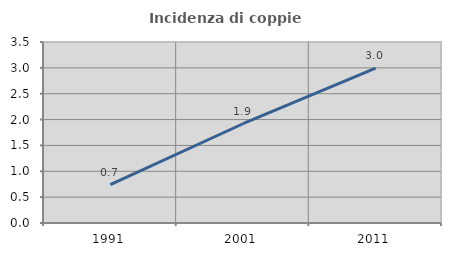
| Category | Incidenza di coppie miste |
|---|---|
| 1991.0 | 0.743 |
| 2001.0 | 1.919 |
| 2011.0 | 2.996 |